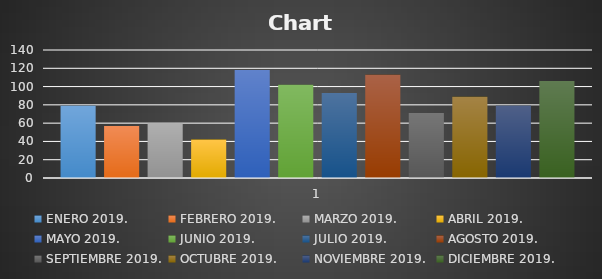
| Category | ENERO 2019. | FEBRERO 2019. | MARZO 2019. | ABRIL 2019. | MAYO 2019. | JUNIO 2019. | JULIO 2019. | AGOSTO 2019. | SEPTIEMBRE 2019. | OCTUBRE 2019. | NOVIEMBRE 2019. | DICIEMBRE 2019. |
|---|---|---|---|---|---|---|---|---|---|---|---|---|
| 0 | 79 | 57 | 60 | 42 | 118 | 102 | 93 | 113 | 71 | 89 | 79 | 106 |